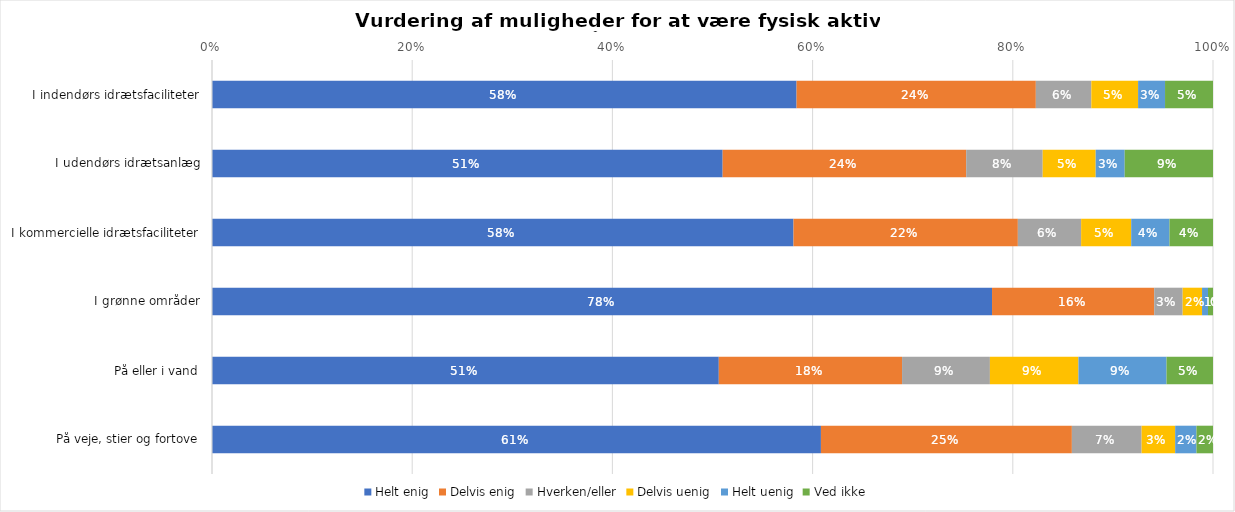
| Category | Helt enig | Delvis enig | Hverken/eller | Delvis uenig | Helt uenig | Ved ikke |
|---|---|---|---|---|---|---|
| I indendørs idrætsfaciliteter | 0.584 | 0.239 | 0.055 | 0.047 | 0.027 | 0.048 |
| I udendørs idrætsanlæg | 0.51 | 0.243 | 0.076 | 0.053 | 0.029 | 0.088 |
| I kommercielle idrætsfaciliteter | 0.581 | 0.224 | 0.063 | 0.05 | 0.038 | 0.043 |
| I grønne områder | 0.779 | 0.162 | 0.028 | 0.019 | 0.006 | 0.005 |
| På eller i vand | 0.506 | 0.183 | 0.088 | 0.088 | 0.088 | 0.046 |
| På veje, stier og fortove | 0.608 | 0.251 | 0.07 | 0.034 | 0.021 | 0.017 |